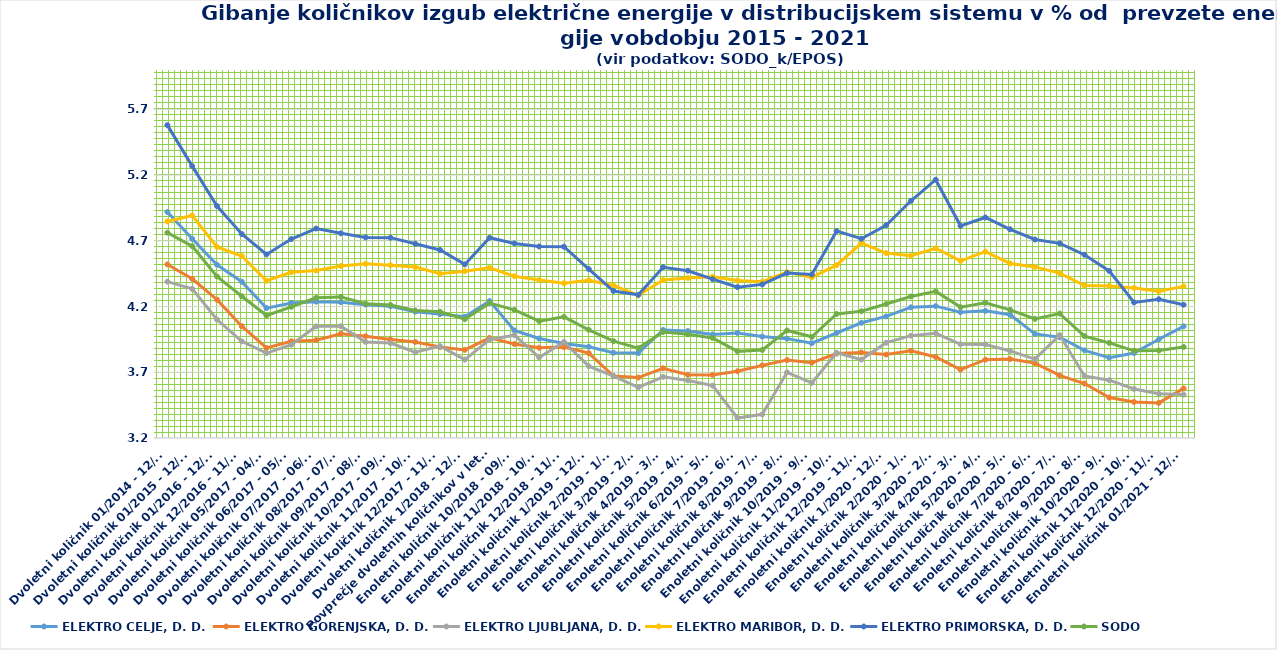
| Category | ELEKTRO CELJE, D. D. | ELEKTRO GORENJSKA, D. D. | ELEKTRO LJUBLJANA, D. D. | ELEKTRO MARIBOR, D. D. | ELEKTRO PRIMORSKA, D. D. | SODO |
|---|---|---|---|---|---|---|
| Dvoletni količnik 01/2014 - 12/2015 | 4.92 | 4.521 | 4.39 | 4.848 | 5.581 | 4.762 |
| Dvoletni količnik 01/2015 - 12/2016 | 4.716 | 4.411 | 4.334 | 4.893 | 5.268 | 4.66 |
| Dvoletni količnik 01/2016 - 12/2017 | 4.518 | 4.253 | 4.101 | 4.654 | 4.965 | 4.429 |
| Dvoletni količnik 12/2016 - 11/2018 | 4.39 | 4.051 | 3.936 | 4.585 | 4.752 | 4.279 |
| Dvoletni količnik 05/2017 - 04/2019 | 4.188 | 3.885 | 3.846 | 4.396 | 4.597 | 4.132 |
| Dvoletni količnik 06/2017 - 05/2019 | 4.228 | 3.936 | 3.909 | 4.461 | 4.714 | 4.198 |
| Dvoletni količnik 07/2017 - 06/2019 | 4.237 | 3.945 | 4.049 | 4.474 | 4.794 | 4.267 |
| Dvoletni količnik 08/2017 - 07/2019 | 4.233 | 3.993 | 4.051 | 4.509 | 4.758 | 4.274 |
| Dvoletni količnik 09/2017 - 08/2019 | 4.215 | 3.974 | 3.93 | 4.525 | 4.726 | 4.222 |
| Dvoletni količnik 10/2017 - 09/2019 | 4.203 | 3.95 | 3.923 | 4.515 | 4.724 | 4.212 |
| Dvoletni količnik 11/2017 - 10/2019 | 4.161 | 3.931 | 3.852 | 4.501 | 4.678 | 4.17 |
| Dvoletni količnik 12/2017 - 11/2019 | 4.143 | 3.892 | 3.899 | 4.45 | 4.63 | 4.16 |
| Dvoletni količnik 1/2018 - 12/2019 | 4.123 | 3.871 | 3.796 | 4.47 | 4.521 | 4.104 |
| Povprečje dvoletnih količnikov v letu 2019 | 4.242 | 3.962 | 3.949 | 4.495 | 4.723 | 4.226 |
| Enoletni količnik 10/2018 - 09/2019 | 4.018 | 3.915 | 3.982 | 4.431 | 4.68 | 4.175 |
| Enoletni količnik 11/2018 - 10/2019 | 3.957 | 3.887 | 3.813 | 4.402 | 4.657 | 4.089 |
| Enoletni količnik 12/2018 - 11/2019 | 3.919 | 3.892 | 3.931 | 4.378 | 4.655 | 4.122 |
| Enoletni količnik 1/2019 - 12/2019 | 3.894 | 3.846 | 3.746 | 4.4 | 4.485 | 4.023 |
| Enoletni količnik 2/2019 - 1/2020 | 3.849 | 3.671 | 3.672 | 4.361 | 4.318 | 3.937 |
| Enoletni količnik 3/2019 - 2/2020 | 3.846 | 3.66 | 3.586 | 4.285 | 4.289 | 3.884 |
| Enoletni količnik 4/2019 - 3/2020 | 4.022 | 3.731 | 3.665 | 4.402 | 4.499 | 4.007 |
| Enoletni količnik 5/2019 - 4/2020 | 4.014 | 3.681 | 3.638 | 4.418 | 4.473 | 3.989 |
| Enoletni količnik 6/2019 - 5/2020 | 3.988 | 3.68 | 3.598 | 4.427 | 4.408 | 3.962 |
| Enoletni količnik 7/2019 - 6/2020 | 3.999 | 3.708 | 3.352 | 4.398 | 4.348 | 3.859 |
| Enoletni količnik 8/2019 - 7/2020 | 3.972 | 3.752 | 3.38 | 4.389 | 4.369 | 3.87 |
| Enoletni količnik 9/2019 - 8/2020 | 3.956 | 3.793 | 3.7 | 4.462 | 4.455 | 4.018 |
| Enoletni količnik 10/2019 - 9/2020 | 3.921 | 3.773 | 3.619 | 4.422 | 4.444 | 3.97 |
| Enoletni količnik 11/2019 - 10/2020 | 3.999 | 3.842 | 3.849 | 4.515 | 4.774 | 4.144 |
| Enoletni količnik 12/2019 - 11/2020 | 4.077 | 3.851 | 3.797 | 4.683 | 4.716 | 4.164 |
| Enoletni količnik 1/2020 - 12/2020 | 4.125 | 3.835 | 3.925 | 4.607 | 4.819 | 4.219 |
| Enoletni količnik 2/2020 - 1/2021 | 4.194 | 3.863 | 3.979 | 4.586 | 5.005 | 4.277 |
| Enoletni količnik 3/2020 - 2/2021 | 4.203 | 3.816 | 3.997 | 4.644 | 5.165 | 4.316 |
| Enoletni količnik 4/2020 - 3/2021 | 4.157 | 3.72 | 3.913 | 4.547 | 4.814 | 4.196 |
| Enoletni količnik 5/2020 - 4/2021 | 4.167 | 3.796 | 3.912 | 4.618 | 4.878 | 4.229 |
| Enoletni količnik 6/2020 - 5/2021 | 4.138 | 3.801 | 3.862 | 4.528 | 4.788 | 4.175 |
| Enoletni količnik 7/2020 - 6/2021 | 3.992 | 3.77 | 3.801 | 4.502 | 4.71 | 4.106 |
| Enoletni količnik 8/2020 - 7/2021 | 3.967 | 3.676 | 3.983 | 4.455 | 4.681 | 4.147 |
| Enoletni količnik 9/2020 - 8/2021 | 3.866 | 3.614 | 3.672 | 4.36 | 4.594 | 3.975 |
| Enoletni količnik 10/2020 - 9/2021 | 3.811 | 3.508 | 3.64 | 4.356 | 4.471 | 3.924 |
| Enoletni količnik 11/2020 - 10/2021 | 3.847 | 3.474 | 3.573 | 4.342 | 4.232 | 3.863 |
| Enoletni količnik 12/2020 - 11/2021 | 3.951 | 3.467 | 3.537 | 4.316 | 4.256 | 3.866 |
| Enoletni količnik 01/2021 - 12/2021 | 4.05 | 3.578 | 3.53 | 4.354 | 4.214 | 3.893 |